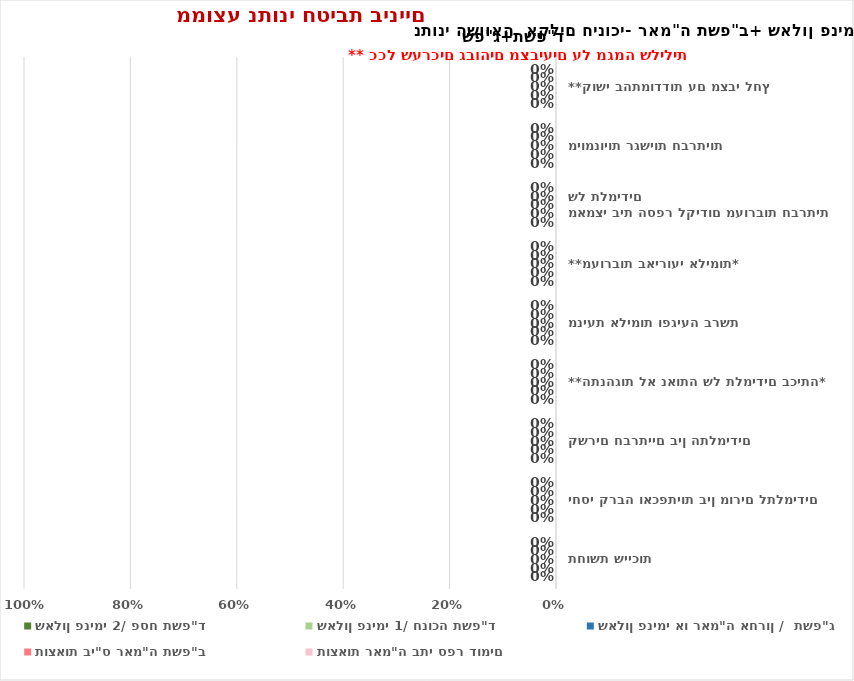
| Category | שאלון פנימי 2/ פסח תשפ"ד  | שאלון פנימי 1/ חנוכה תשפ"ד | שאלון פנימי או ראמ"ה אחרון /  תשפ"ג   | תוצאות בי"ס ראמ"ה תשפ"ב  | תוצאות ראמ"ה בתי ספר דומים   |
|---|---|---|---|---|---|
| תחושת שייכות | 0 | 0 | 0 | 0 | 0 |
| יחסי קרבה ואכפתיות בין מורים לתלמידים | 0 | 0 | 0 | 0 | 0 |
| קשרים חברתיים בין התלמידים | 0 | 0 | 0 | 0 | 0 |
| **התנהגות לא נאותה של תלמידים בכיתה* | 0 | 0 | 0 | 0 | 0 |
| מניעת אלימות ופגיעה ברשת | 0 | 0 | 0 | 0 | 0 |
| **מעורבות באירועי אלימות* | 0 | 0 | 0 | 0 | 0 |
| מאמצי בית הספר לקידום מעורבות חברתית של תלמידים | 0 | 0 | 0 | 0 | 0 |
| מיומנויות רגשיות חברתיות | 0 | 0 | 0 | 0 | 0 |
| **קושי בהתמודדות עם מצבי לחץ | 0 | 0 | 0 | 0 | 0 |